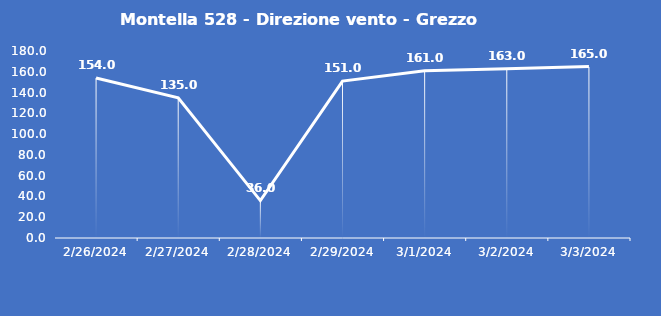
| Category | Montella 528 - Direzione vento - Grezzo (°N) |
|---|---|
| 2/26/24 | 154 |
| 2/27/24 | 135 |
| 2/28/24 | 36 |
| 2/29/24 | 151 |
| 3/1/24 | 161 |
| 3/2/24 | 163 |
| 3/3/24 | 165 |